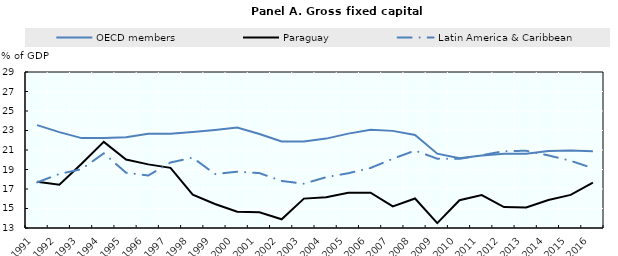
| Category | OECD members | Paraguay | Latin America & Caribbean |
|---|---|---|---|
| 1991.0 | 23.553 | 17.749 | 17.679 |
| 1992.0 | 22.833 | 17.444 | 18.541 |
| 1993.0 | 22.22 | 19.585 | 19.037 |
| 1994.0 | 22.237 | 21.832 | 20.659 |
| 1995.0 | 22.309 | 20.028 | 18.669 |
| 1996.0 | 22.66 | 19.525 | 18.384 |
| 1997.0 | 22.657 | 19.171 | 19.72 |
| 1998.0 | 22.857 | 16.423 | 20.213 |
| 1999.0 | 23.053 | 15.466 | 18.535 |
| 2000.0 | 23.299 | 14.674 | 18.775 |
| 2001.0 | 22.639 | 14.613 | 18.628 |
| 2002.0 | 21.881 | 13.895 | 17.823 |
| 2003.0 | 21.876 | 16.015 | 17.544 |
| 2004.0 | 22.168 | 16.145 | 18.212 |
| 2005.0 | 22.679 | 16.611 | 18.617 |
| 2006.0 | 23.065 | 16.619 | 19.16 |
| 2007.0 | 22.962 | 15.214 | 20.1 |
| 2008.0 | 22.534 | 16.023 | 20.944 |
| 2009.0 | 20.624 | 13.505 | 20.107 |
| 2010.0 | 20.152 | 15.853 | 20.096 |
| 2011.0 | 20.425 | 16.379 | 20.467 |
| 2012.0 | 20.622 | 15.146 | 20.882 |
| 2013.0 | 20.608 | 15.114 | 20.922 |
| 2014.0 | 20.904 | 15.867 | 20.445 |
| 2015.0 | 20.938 | 16.398 | 19.893 |
| 2016.0 | 20.863 | 17.655 | 19.129 |